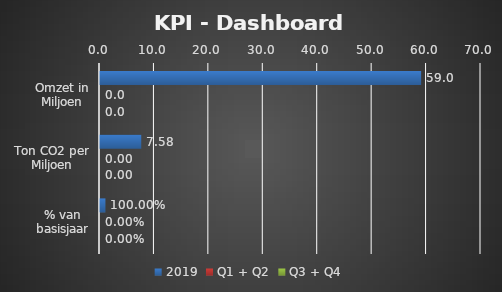
| Category | 2019 | Q1 + Q2 | Q3 + Q4 |
|---|---|---|---|
| Omzet in Miljoen | 59 | 0 | 0 |
| Ton CO2 per Miljoen | 7.578 | 0 | 0 |
| % van basisjaar | 1 | 0 | 0 |